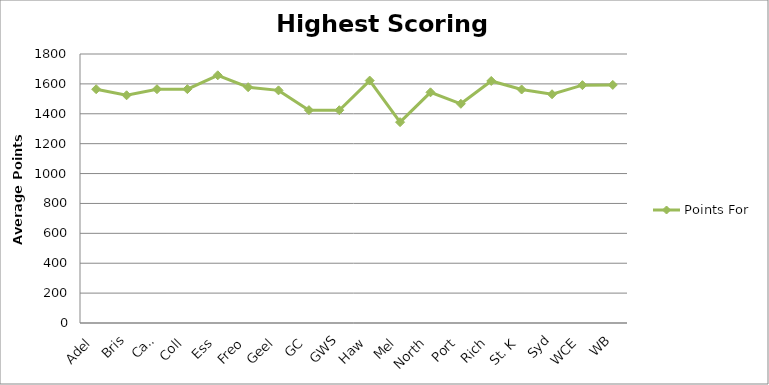
| Category | Points For |
|---|---|
| Adel | 1564.375 |
| Bris | 1523.75 |
| Carl | 1564.375 |
| Coll | 1564.875 |
| Ess | 1657.5 |
| Freo | 1577.875 |
| Geel | 1556.625 |
| GC | 1424.375 |
| GWS | 1423.875 |
| Haw | 1622.25 |
| Mel | 1343.875 |
| North | 1543.625 |
| Port | 1466.75 |
| Rich | 1619.625 |
| St. K | 1562.375 |
| Syd | 1530.625 |
| WCE | 1591.5 |
| WB | 1593.125 |